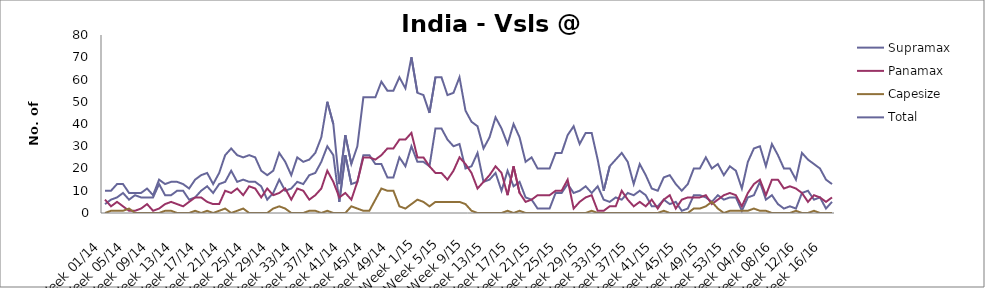
| Category | Supramax | Panamax | Capesize | Total |
|---|---|---|---|---|
| Week 01/14 | 4 | 6 | 0 | 10 |
| Week 02/14 | 6 | 3 | 1 | 10 |
| Week 03/14 | 7 | 5 | 1 | 13 |
| Week 04/14 | 9 | 3 | 1 | 13 |
| Week 05/14 | 6 | 1 | 2 | 9 |
| Week 06/14 | 8 | 1 | 0 | 9 |
| Week 07/14 | 7 | 2 | 0 | 9 |
| Week 08/14 | 7 | 4 | 0 | 11 |
| Week 09/14 | 7 | 1 | 0 | 8 |
| Week 10/14 | 13 | 2 | 0 | 15 |
| Week 11/14 | 8 | 4 | 1 | 13 |
| Week 12/14 | 8 | 5 | 1 | 14 |
| Week 13/14 | 10 | 4 | 0 | 14 |
| Week 14/14 | 10 | 3 | 0 | 13 |
| Week 15/14 | 6 | 5 | 0 | 11 |
| Week 16/14 | 7 | 7 | 1 | 15 |
| Week 17/14 | 10 | 7 | 0 | 17 |
| Week 18/14 | 12 | 5 | 1 | 18 |
| Week 19/14 | 9 | 4 | 0 | 13 |
| Week 20/14 | 13 | 4 | 1 | 18 |
| Week 21/14 | 14 | 10 | 2 | 26 |
| Week 22/14 | 19 | 9 | 0 | 29 |
| Week 23/14 | 14 | 11 | 1 | 26 |
| Week 24/14 | 15 | 8 | 2 | 25 |
| Week 25/14 | 14 | 12 | 0 | 26 |
| Week 26/14 | 14 | 11 | 0 | 25 |
| Week 27/14 | 12 | 7 | 0 | 19 |
| Week 28/14 | 6 | 11 | 0 | 17 |
| Week 29/14 | 9 | 8 | 2 | 19 |
| Week 30/14 | 15 | 9 | 3 | 27 |
| Week 31/14 | 10 | 11 | 2 | 23 |
| Week 32/14 | 11 | 6 | 0 | 17 |
| Week 33/14 | 14 | 11 | 0 | 25 |
| Week 34/14 | 13 | 10 | 0 | 23 |
| Week 35/14 | 17 | 6 | 1 | 24 |
| Week 36/14 | 18 | 8 | 1 | 27 |
| Week 37/14 | 23 | 11 | 0 | 34 |
| Week 38/14 | 30 | 19 | 1 | 50 |
| Week 39/14 | 26 | 14 | 0 | 40 |
| Week 40/14 | 5 | 7 | 0 | 13 |
| Week 41/14 | 26 | 9 | 0 | 35 |
| Week 42/14 | 13 | 6 | 3 | 22 |
| Week 43/14 | 14 | 14 | 2 | 30 |
| Week 44/14 | 26 | 25 | 1 | 52 |
| Week 45/14 | 26 | 25 | 1 | 52 |
| Week 46/14 | 22 | 24 | 6 | 52 |
| Week 47/14 | 22 | 26 | 11 | 59 |
| Week 48/14 | 16 | 29 | 10 | 55 |
| Week 49/14 | 16 | 29 | 10 | 55 |
| Week 50/14 | 25 | 33 | 3 | 61 |
| Week 51/14 | 21 | 33 | 2 | 56 |
| Week 52/14 | 30 | 36 | 4 | 70 |
| Week 1/15 | 23 | 25 | 6 | 54 |
| Week 2/15 | 23 | 25 | 5 | 53 |
| Week 3/15 | 21 | 21 | 3 | 45 |
| Week 4/15 | 38 | 18 | 5 | 61 |
| Week 5/15 | 38 | 18 | 5 | 61 |
| Week 6/15 | 33 | 15 | 5 | 53 |
| Week 7/15 | 30 | 19 | 5 | 54 |
| Week 8/15 | 31 | 25 | 5 | 61 |
| Week 9/15 | 20 | 22 | 4 | 46 |
| Week 10/15 | 21 | 18 | 1 | 41 |
| Week 11/15 | 27 | 11 | 0 | 39 |
| Week 12/15 | 14 | 14 | 0 | 29 |
| Week 13/15 | 15 | 17 | 0 | 34 |
| Week 14/15 | 18 | 21 | 0 | 43 |
| Week 15/15 | 10 | 18 | 0 | 38 |
| Week 16/15 | 19 | 8 | 1 | 31 |
| Week 17/15 | 12 | 21 | 0 | 40 |
| Week 18/15 | 14 | 9 | 1 | 34 |
| Week 19/15 | 7 | 5 | 0 | 23 |
| Week 20/15 | 6 | 6 | 0 | 25 |
| Week 21/15 | 2 | 8 | 0 | 20 |
| Week 22/15 | 2 | 8 | 0 | 20 |
| Week 23/15 | 2 | 8 | 0 | 20 |
| Week 24/15 | 9 | 10 | 0 | 27 |
| Week 25/15 | 9 | 10 | 0 | 27 |
| Week 26/15 | 13 | 15 | 0 | 35 |
| Week 27/15 | 9 | 2 | 0 | 39 |
| Week 28/15 | 10 | 5 | 0 | 31 |
| Week 29/15 | 12 | 7 | 0 | 36 |
| Week 30/15 | 9 | 8 | 1 | 36 |
| Week 31/15 | 12 | 1 | 0 | 24 |
| Week 32/15 | 6 | 1 | 0 | 10 |
| Week 33/15 | 5 | 3 | 0 | 21 |
| Week 34/15 | 7 | 3 | 0 | 24 |
| Week 35/15 | 6 | 10 | 0 | 27 |
| Week 36/15 | 9 | 6 | 0 | 23 |
| Week 37/15 | 8 | 3 | 0 | 13 |
| Week 38/15 | 10 | 5 | 0 | 22 |
| Week 39/15 | 8 | 3 | 0 | 17 |
| Week 40/15 | 3 | 6 | 0 | 11 |
| Week 41/15 | 3 | 2 | 0 | 10 |
| Week 42/15 | 6 | 6 | 1 | 16 |
| Week 43/15 | 4 | 8 | 0 | 17 |
| Week 44/15 | 5 | 2 | 0 | 13 |
| Week 45/15 | 1 | 6 | 0 | 10 |
| Week 46/15 | 2 | 7 | 0 | 13 |
| Week 47/15 | 8 | 7 | 2 | 20 |
| Week 48/15 | 8 | 7 | 2 | 20 |
| Week 49/15 | 7 | 8 | 3 | 25 |
| Week 50/15 | 5 | 4 | 5 | 20 |
| Week 51/15 | 8 | 6 | 2 | 22 |
| Week 52/15 | 6 | 8 | 0 | 17 |
| Week 53/15 | 7 | 9 | 1 | 21 |
| Week 01/16 | 7 | 8 | 1 | 19 |
| Week 02/16 | 1 | 3 | 1 | 11 |
| Week 03/16 | 7 | 9 | 1 | 23 |
| Week 04/16 | 8 | 13 | 2 | 29 |
| Week 05/16 | 14 | 15 | 1 | 30 |
| Week 06/16 | 6 | 8 | 1 | 21 |
| Week 07/16 | 8 | 15 | 0 | 31 |
| Week 08/16 | 4 | 15 | 0 | 26 |
| Week 09/16 | 2 | 11 | 0 | 20 |
| Week 10/16 | 3 | 12 | 0 | 20 |
| Week 11/16 | 2 | 11 | 1 | 15 |
| Week 12/16 | 9 | 9 | 0 | 27 |
| Week 13/16 | 10 | 5 | 0 | 24 |
| Week 14/16 | 6 | 8 | 1 | 22 |
| Week 15/16 | 7 | 7 | 0 | 20 |
| Week 16/16 | 2 | 5 | 0 | 15 |
| Week 17/16 | 5 | 7 | 0 | 13 |